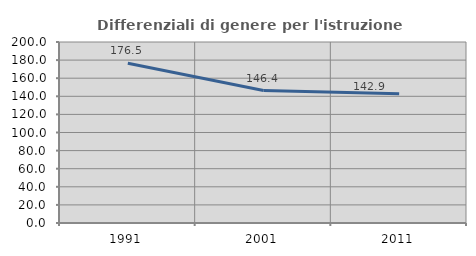
| Category | Differenziali di genere per l'istruzione superiore |
|---|---|
| 1991.0 | 176.451 |
| 2001.0 | 146.376 |
| 2011.0 | 142.947 |